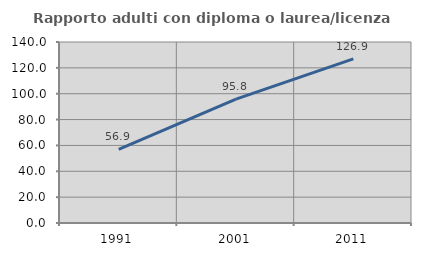
| Category | Rapporto adulti con diploma o laurea/licenza media  |
|---|---|
| 1991.0 | 56.948 |
| 2001.0 | 95.752 |
| 2011.0 | 126.929 |